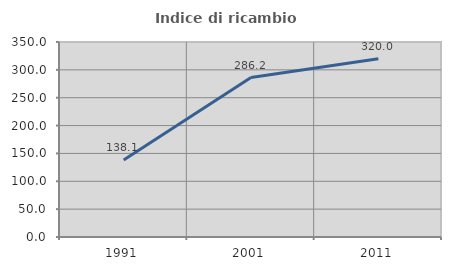
| Category | Indice di ricambio occupazionale  |
|---|---|
| 1991.0 | 138.053 |
| 2001.0 | 286.154 |
| 2011.0 | 320 |